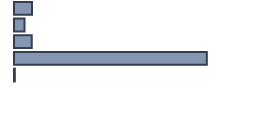
| Category | Percentatge |
|---|---|
| 0 | 7.532 |
| 1 | 4.329 |
| 2 | 7.446 |
| 3 | 80.346 |
| 4 | 0.346 |
| 5 | 0 |